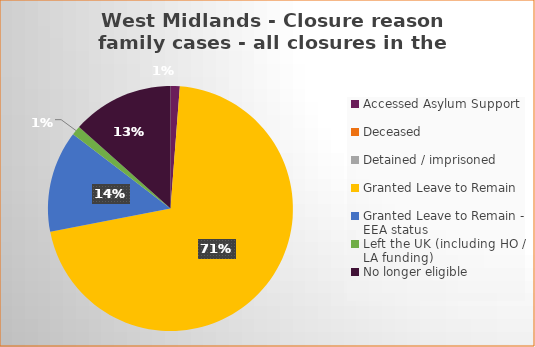
| Category | Total | Percentage |
|---|---|---|
| Accessed Asylum Support | 1 | 0.012 |
| Deceased | 0 | 0 |
| Detained / imprisoned | 0 | 0 |
| Granted Leave to Remain | 58 | 0.707 |
| Granted Leave to Remain - EEA status | 11 | 0.14 |
| Left the UK (including HO / LA funding)  | 1 | 0.012 |
| No longer eligible | 11 | 0.134 |